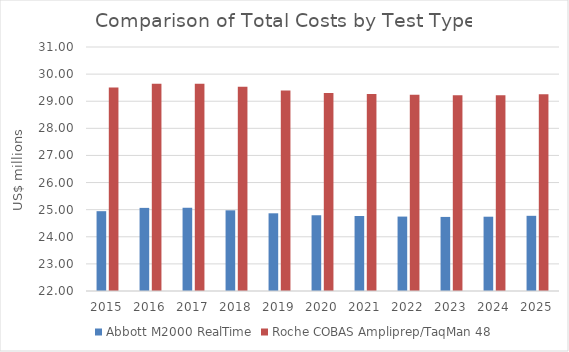
| Category | Abbott M2000 RealTime | Roche COBAS Ampliprep/TaqMan 48 |
|---|---|---|
| 2015.0 | 24.944 | 29.502 |
| 2016.0 | 25.066 | 29.646 |
| 2017.0 | 25.07 | 29.648 |
| 2018.0 | 24.975 | 29.529 |
| 2019.0 | 24.866 | 29.393 |
| 2020.0 | 24.794 | 29.302 |
| 2021.0 | 24.767 | 29.266 |
| 2022.0 | 24.745 | 29.236 |
| 2023.0 | 24.733 | 29.217 |
| 2024.0 | 24.74 | 29.222 |
| 2025.0 | 24.773 | 29.259 |